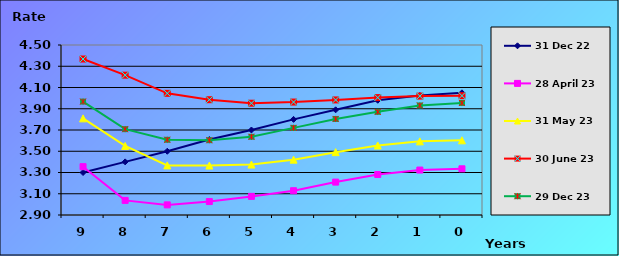
| Category | 31 Dec 22 | 28 April 23 | 31 May 23 | 30 June 23 | 29 Dec 23 |
|---|---|---|---|---|---|
| 9.0 | 3.3 | 3.355 | 3.81 | 4.368 | 3.968 |
| 8.0 | 3.4 | 3.038 | 3.55 | 4.216 | 3.708 |
| 7.0 | 3.5 | 2.995 | 3.367 | 4.045 | 3.608 |
| 6.0 | 3.61 | 3.026 | 3.365 | 3.985 | 3.604 |
| 5.0 | 3.7 | 3.075 | 3.375 | 3.952 | 3.636 |
| 4.0 | 3.8 | 3.128 | 3.421 | 3.963 | 3.72 |
| 3.0 | 3.89 | 3.21 | 3.492 | 3.983 | 3.804 |
| 2.0 | 3.98 | 3.281 | 3.554 | 4.005 | 3.871 |
| 1.0 | 4.025 | 3.323 | 3.593 | 4.019 | 3.931 |
| 0.0 | 4.05 | 3.335 | 3.603 | 4.023 | 3.955 |